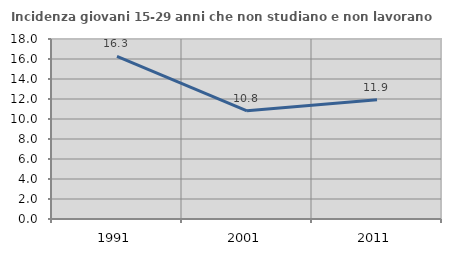
| Category | Incidenza giovani 15-29 anni che non studiano e non lavorano  |
|---|---|
| 1991.0 | 16.251 |
| 2001.0 | 10.815 |
| 2011.0 | 11.918 |